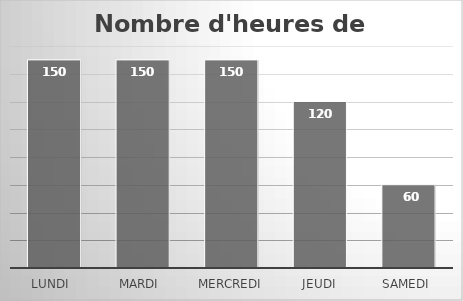
| Category | Nombre d'heures de cours |
|---|---|
| Lundi  | 150 |
| Mardi  | 150 |
| Mercredi | 150 |
| Jeudi | 120 |
| Samedi  | 60 |